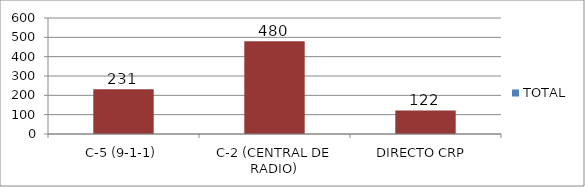
| Category | TOTAL |
|---|---|
| C-5 (9-1-1) | 231 |
| C-2 (CENTRAL DE RADIO) | 480 |
| DIRECTO CRP  | 122 |